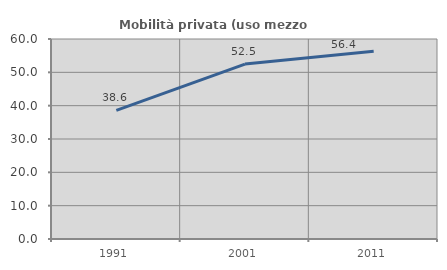
| Category | Mobilità privata (uso mezzo privato) |
|---|---|
| 1991.0 | 38.562 |
| 2001.0 | 52.476 |
| 2011.0 | 56.352 |